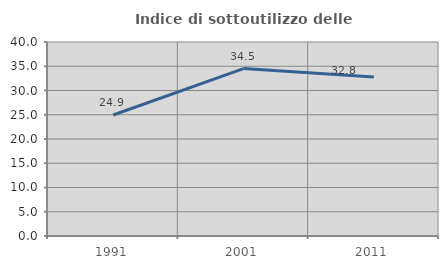
| Category | Indice di sottoutilizzo delle abitazioni  |
|---|---|
| 1991.0 | 24.947 |
| 2001.0 | 34.526 |
| 2011.0 | 32.78 |